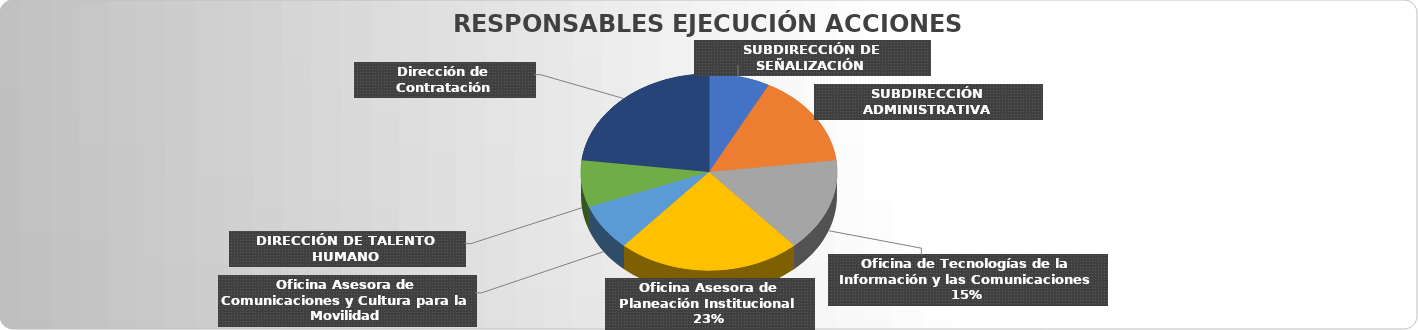
| Category | Total |
|---|---|
| SUBDIRECCIÓN DE SEÑALIZACIÓN | 1 |
| SUBDIRECCIÓN ADMINISTRATIVA | 2 |
| Oficina de Tecnologías de la Información y las Comunicaciones | 2 |
| Oficina Asesora de Planeación Institucional | 3 |
| Oficina Asesora de Comunicaciones y Cultura para la Movilidad | 1 |
| DIRECCIÓN DE TALENTO HUMANO | 1 |
| Dirección de Contratación | 3 |